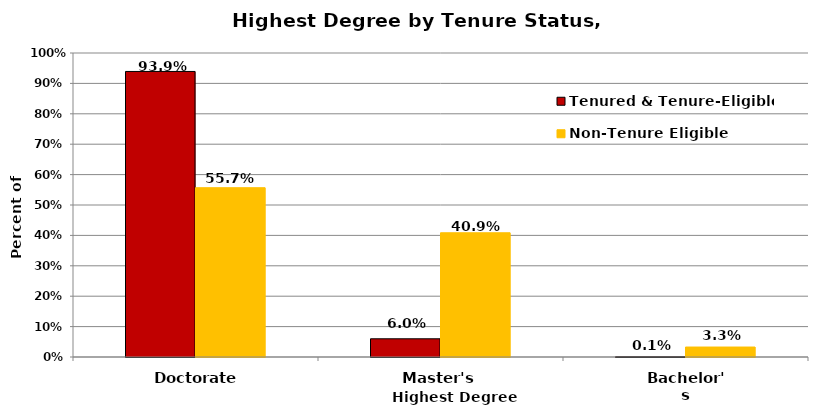
| Category | Tenured & Tenure-Eligible | Non-Tenure Eligible |
|---|---|---|
| Doctorate | 0.939 | 0.557 |
| Master's | 0.06 | 0.409 |
| Bachelor's | 0.001 | 0.033 |